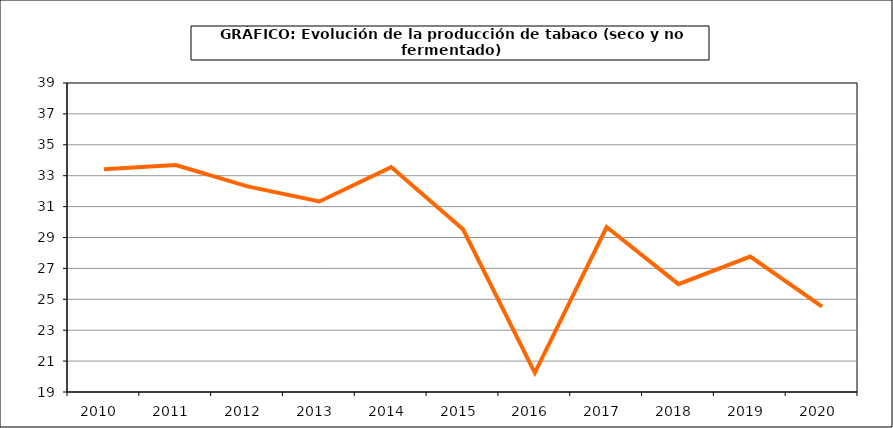
| Category | Producción |
|---|---|
| 2010.0 | 33.41 |
| 2011.0 | 33.692 |
| 2012.0 | 32.308 |
| 2013.0 | 31.333 |
| 2014.0 | 33.557 |
| 2015.0 | 29.534 |
| 2016.0 | 20.238 |
| 2017.0 | 29.679 |
| 2018.0 | 25.983 |
| 2019.0 | 27.766 |
| 2020.0 | 24.532 |